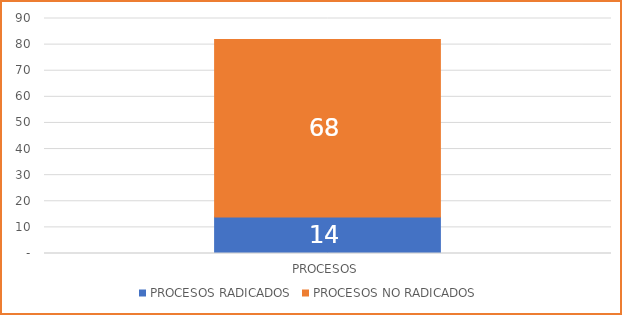
| Category |  PROCESOS RADICADOS  |  PROCESOS NO RADICADOS  |
|---|---|---|
|  PROCESOS  | 14 | 68 |